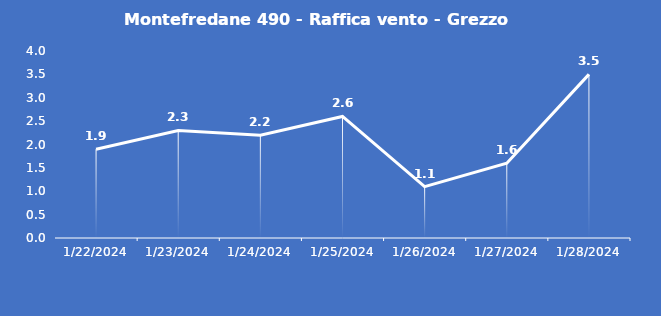
| Category | Montefredane 490 - Raffica vento - Grezzo (m/s) |
|---|---|
| 1/22/24 | 1.9 |
| 1/23/24 | 2.3 |
| 1/24/24 | 2.2 |
| 1/25/24 | 2.6 |
| 1/26/24 | 1.1 |
| 1/27/24 | 1.6 |
| 1/28/24 | 3.5 |